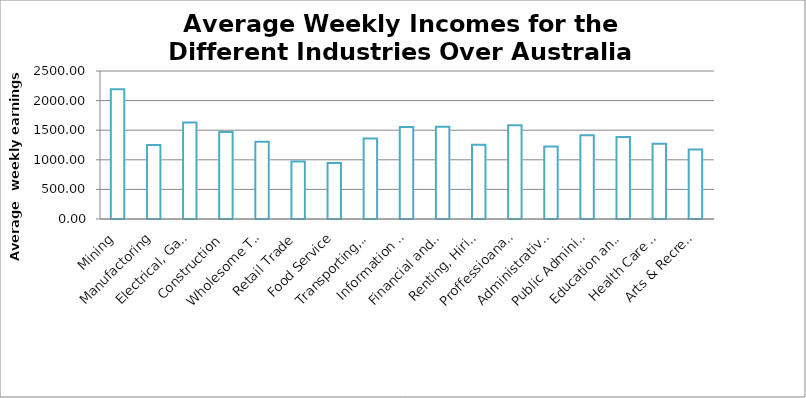
| Category | Series 0 |
|---|---|
| Mining | 2192.25 |
| Manufactoring | 1250.32 |
| Electrical, Gas, Water and Waste removals | 1629.87 |
| Construction | 1468.58 |
| Wholesome Trade | 1304.05 |
| Retail Trade | 971.64 |
| Food Service | 944.85 |
| Transporting, Postal and Warehouse | 1361.61 |
| Information Media & Telecommunication | 1555.75 |
| Financial and Insurance Services | 1559.83 |
| Renting, Hiring & real Estate Services | 1255.08 |
| Proffessioanal, scientific & technical services | 1581.94 |
| Administrative & Support Services | 1226.3 |
| Public Administrations & Safety | 1412.76 |
| Education and Training | 1385.91 |
| Health Care & Social Assistance | 1272.47 |
| Arts & Recreation Services | 1173.41 |